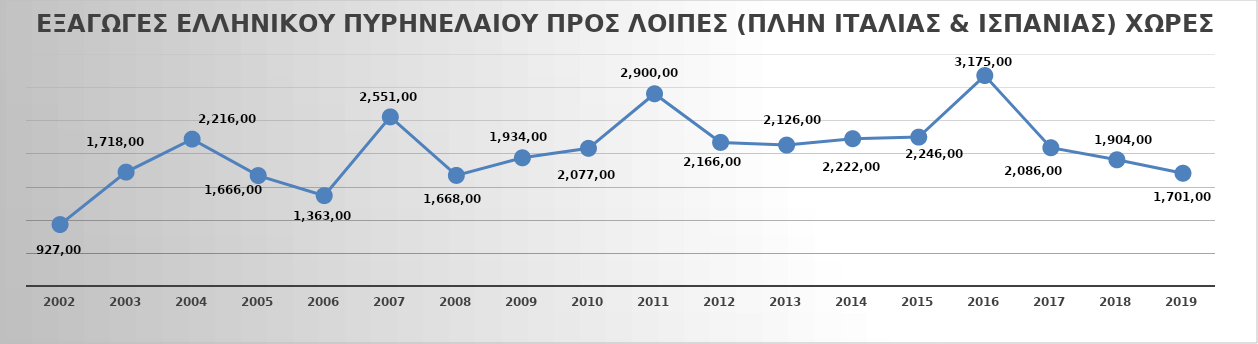
| Category | ΕΞΑΓΩΓΕΣ ΠΡΟΣ ΛΟΙΠΕΣ ΧΩΡΕΣ |
|---|---|
| 2002 | 927000 |
| 2003 | 1718000 |
| 2004 | 2216000 |
| 2005 | 1666000 |
| 2006 | 1363000 |
| 2007 | 2551000 |
| 2008 | 1668000 |
| 2009 | 1934000 |
| 2010 | 2077000 |
| 2011 | 2900000 |
| 2012 | 2166000 |
| 2013 | 2126000 |
| 2014 | 2222000 |
| 2015 | 2246000 |
| 2016 | 3175000 |
| 2017 | 2086000 |
| 2018 | 1904000 |
| 2019 | 1701000 |